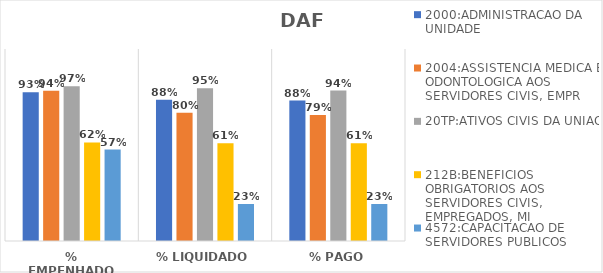
| Category | 2000:ADMINISTRACAO DA UNIDADE | 2004:ASSISTENCIA MEDICA E ODONTOLOGICA AOS SERVIDORES CIVIS, EMPR | 20TP:ATIVOS CIVIS DA UNIAO | 212B:BENEFICIOS OBRIGATORIOS AOS SERVIDORES CIVIS, EMPREGADOS, MI | 4572:CAPACITACAO DE SERVIDORES PUBLICOS FEDERAIS EM PROCESSO DE Q |
|---|---|---|---|---|---|
| % EMPENHADO | 0.93 | 0.94 | 0.967 | 0.616 | 0.571 |
| % LIQUIDADO | 0.883 | 0.801 | 0.955 | 0.611 | 0.231 |
| % PAGO | 0.878 | 0.787 | 0.94 | 0.611 | 0.231 |